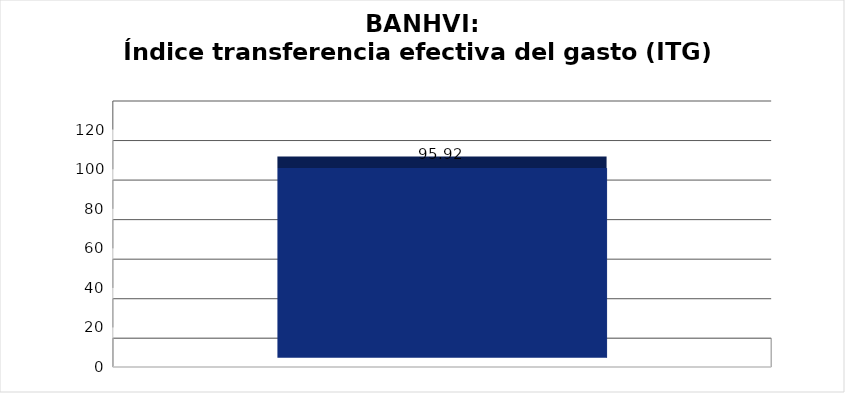
| Category | Índice transferencia efectiva del gasto (ITG) |
|---|---|
|  | 95.924 |